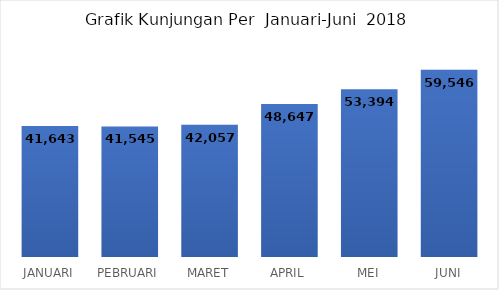
| Category |  41,643  |
|---|---|
| JANUARI | 41643 |
| PEBRUARI | 41545 |
| MARET | 42057 |
| APRIL | 48647 |
| MEI | 53394 |
| JUNI | 59546 |